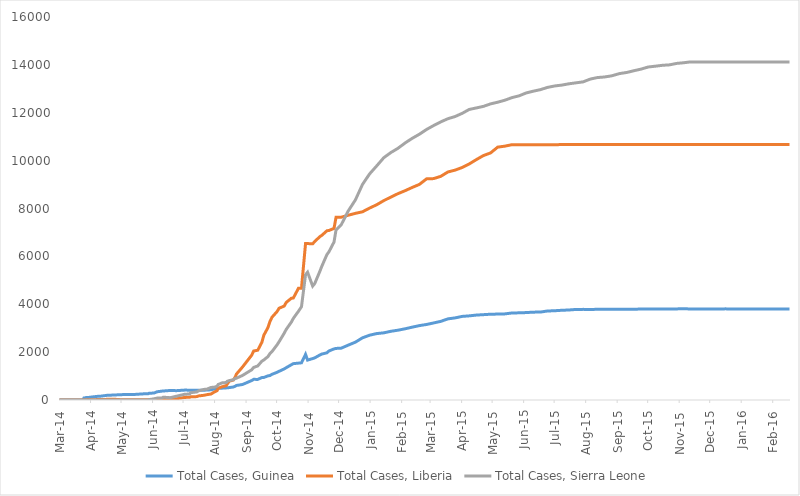
| Category | Total Cases, Guinea | Total Cases, Liberia | Total Cases, Sierra Leone |
|---|---|---|---|
| 2014-03-01 | 0 | 0 | 0 |
| 2014-03-02 | 0 | 0 | 0 |
| 2014-03-03 | 0 | 0 | 0 |
| 2014-03-04 | 0 | 0 | 0 |
| 2014-03-05 | 0 | 0 | 0 |
| 2014-03-06 | 0 | 0 | 0 |
| 2014-03-07 | 0 | 0 | 0 |
| 2014-03-08 | 0 | 0 | 0 |
| 2014-03-09 | 0 | 0 | 0 |
| 2014-03-10 | 0 | 0 | 0 |
| 2014-03-11 | 0 | 0 | 0 |
| 2014-03-12 | 0 | 0 | 0 |
| 2014-03-13 | 0 | 0 | 0 |
| 2014-03-14 | 0 | 0 | 0 |
| 2014-03-15 | 0 | 0 | 0 |
| 2014-03-16 | 0 | 0 | 0 |
| 2014-03-17 | 0 | 0 | 0 |
| 2014-03-18 | 0 | 0 | 0 |
| 2014-03-19 | 0 | 0 | 0 |
| 2014-03-20 | 0 | 0 | 0 |
| 2014-03-21 | 0 | 0 | 0 |
| 2014-03-22 | 0 | 0 | 0 |
| 2014-03-23 | 0 | 0 | 0 |
| 2014-03-24 | 0 | 0 | 0 |
| 2014-03-25 | 86 | 0 | 0 |
| 2014-03-26 | 86 | 0 | 0 |
| 2014-03-27 | 103 | 8 | 6 |
| 2014-03-31 | 112 | 8 | 0 |
| 2014-04-01 | 122 | 8 | 0 |
| 2014-04-02 | 127 | 8 | 0 |
| 2014-04-07 | 151 | 18 | 0 |
| 2014-04-10 | 157 | 22 | 0 |
| 2014-04-17 | 197 | 27 | 0 |
| 2014-04-21 | 203 | 27 | 0 |
| 2014-04-23 | 208 | 34 | 0 |
| 2014-04-30 | 221 | 13 | 0 |
| 2014-05-05 | 231 | 13 | 0 |
| 2014-05-14 | 233 | 12 | 0 |
| 2014-05-23 | 258 | 12 | 0 |
| 2014-05-27 | 258 | 12 | 1 |
| 2014-05-28 | 281 | 12 | 16 |
| 2014-06-02 | 291 | 13 | 50 |
| 2014-06-05 | 344 | 13 | 81 |
| 2014-06-10 | 372 | 15 | 89 |
| 2014-06-11 | 376 | 15 | 117 |
| 2014-06-18 | 398 | 33 | 97 |
| 2014-06-24 | 390 | 51 | 158 |
| 2014-07-02 | 413 | 107 | 239 |
| 2014-07-07 | 412 | 115 | 252 |
| 2014-07-08 | 408 | 131 | 305 |
| 2014-07-14 | 409 | 142 | 337 |
| 2014-07-16 | 406 | 172 | 386 |
| 2014-07-21 | 410 | 196 | 442 |
| 2014-07-24 | 415 | 224 | 454 |
| 2014-07-28 | 427 | 249 | 525 |
| 2014-07-31 | 460 | 329 | 533 |
| 2014-08-03 | 472 | 391 | 574 |
| 2014-08-04 | 485 | 486 | 646 |
| 2014-08-08 | 495 | 554 | 717 |
| 2014-08-12 | 506 | 599 | 730 |
| 2014-08-13 | 510 | 670 | 783 |
| 2014-08-15 | 519 | 786 | 810 |
| 2014-08-19 | 543 | 834 | 848 |
| 2014-08-21 | 579 | 972 | 907 |
| 2014-08-22 | 607 | 1082 | 910 |
| 2014-08-28 | 648 | 1378 | 1026 |
| 2014-09-06 | 812 | 1871 | 1261 |
| 2014-09-08 | 862 | 2046 | 1361 |
| 2014-09-12 | 861 | 2081 | 1424 |
| 2014-09-16 | 936 | 2407 | 1620 |
| 2014-09-18 | 942 | 2710 | 1673 |
| 2014-09-22 | 1008 | 3022 | 1813 |
| 2014-09-24 | 1022 | 3280 | 1940 |
| 2014-09-26 | 1074 | 3458 | 2021 |
| 2014-10-01 | 1157 | 3696 | 2304 |
| 2014-10-03 | 1199 | 3834 | 2437 |
| 2014-10-08 | 1298 | 3924 | 2789 |
| 2014-10-10 | 1350 | 4076 | 2950 |
| 2014-10-15 | 1472 | 4249 | 3252 |
| 2014-10-17 | 1519 | 4262 | 3410 |
| 2014-10-22 | 1540 | 4665 | 3706 |
| 2014-10-25 | 1553 | 4665 | 3896 |
| 2014-10-29 | 1906 | 6535 | 5235 |
| 2014-10-31 | 1667 | 6535 | 5338 |
| 2014-11-05 | 1731 | 6525 | 4759 |
| 2014-11-07 | 1760 | 6619 | 4862 |
| 2014-11-12 | 1878 | 6822 | 5368 |
| 2014-11-14 | 1919 | 6878 | 5586 |
| 2014-11-19 | 1971 | 7069 | 6073 |
| 2014-11-21 | 2047 | 7082 | 6190 |
| 2014-11-26 | 2134 | 7168 | 6599 |
| 2014-11-28 | 2155 | 7635 | 7109 |
| 2014-12-03 | 2164 | 7635 | 7312 |
| 2014-12-10 | 2292 | 7719 | 7897 |
| 2014-12-17 | 2416 | 7797 | 8356 |
| 2014-12-24 | 2597 | 7862 | 9004 |
| 2014-12-31 | 2707 | 8018 | 9446 |
| 2015-01-07 | 2775 | 8157 | 9780 |
| 2015-01-14 | 2806 | 8331 | 10124 |
| 2015-01-21 | 2871 | 8478 | 10340 |
| 2015-01-28 | 2917 | 8622 | 10518 |
| 2015-02-04 | 2975 | 8745 | 10740 |
| 2015-02-11 | 3044 | 8881 | 10934 |
| 2015-02-18 | 3108 | 9007 | 11103 |
| 2015-02-25 | 3155 | 9238 | 11301 |
| 2015-03-04 | 3219 | 9249 | 11466 |
| 2015-03-11 | 3285 | 9343 | 11619 |
| 2015-03-18 | 3389 | 9526 | 11751 |
| 2015-03-25 | 3429 | 9602 | 11841 |
| 2015-04-01 | 3492 | 9712 | 11974 |
| 2015-04-08 | 3515 | 9862 | 12138 |
| 2015-04-15 | 3548 | 10042 | 12201 |
| 2015-04-22 | 3565 | 10212 | 12267 |
| 2015-04-29 | 3584 | 10322 | 12371 |
| 2015-05-06 | 3589 | 10564 | 12440 |
| 2015-05-13 | 3597 | 10604 | 12523 |
| 2015-05-20 | 3635 | 10666 | 12632 |
| 2015-05-27 | 3641 | 10666 | 12706 |
| 2015-06-03 | 3652 | 10666 | 12827 |
| 2015-06-10 | 3670 | 10666 | 12901 |
| 2015-06-17 | 3674 | 10666 | 12965 |
| 2015-06-24 | 3718 | 10666 | 13059 |
| 2015-07-01 | 3729 | 10666 | 13119 |
| 2015-07-08 | 3748 | 10670 | 13155 |
| 2015-07-15 | 3760 | 10673 | 13209 |
| 2015-07-22 | 3783 | 10672 | 13250 |
| 2015-07-29 | 3786 | 10672 | 13290 |
| 2015-08-05 | 3784 | 10672 | 13406 |
| 2015-08-12 | 3787 | 10672 | 13470 |
| 2015-08-19 | 3786 | 10672 | 13494 |
| 2015-08-26 | 3792 | 10672 | 13541 |
| 2015-09-03 | 3792 | 10672 | 13638 |
| 2015-09-10 | 3792 | 10672 | 13683 |
| 2015-09-17 | 3792 | 10672 | 13756 |
| 2015-09-24 | 3800 | 10672 | 13823 |
| 2015-10-01 | 3805 | 10672 | 13911 |
| 2015-10-08 | 3804 | 10672 | 13945 |
| 2015-10-15 | 3800 | 10672 | 13982 |
| 2015-10-22 | 3803 | 10672 | 14001 |
| 2015-10-29 | 3806 | 10672 | 14061 |
| 2015-11-05 | 3810 | 10672 | 14089 |
| 2015-11-11 | 3805 | 10672 | 14122 |
| 2015-11-18 | 3804 | 10672 | 14122 |
| 2015-11-25 | 3804 | 10675 | 14122 |
| 2015-12-02 | 3804 | 10675 | 14122 |
| 2015-12-09 | 3804 | 10675 | 14122 |
| 2015-12-16 | 3807 | 10675 | 14122 |
| 2015-12-23 | 3804 | 10675 | 14122 |
| 2015-12-30 | 3804 | 10675 | 14122 |
| 2016-01-06 | 3804 | 10675 | 14122 |
| 2016-01-13 | 3804 | 10675 | 14122 |
| 2016-01-20 | 3804 | 10675 | 14123 |
| 2016-01-27 | 3804 | 10675 | 14124 |
| 2016-02-03 | 3804 | 10675 | 14124 |
| 2016-02-10 | 3804 | 10675 | 14124 |
| 2016-02-17 | 3804 | 10675 | 14124 |